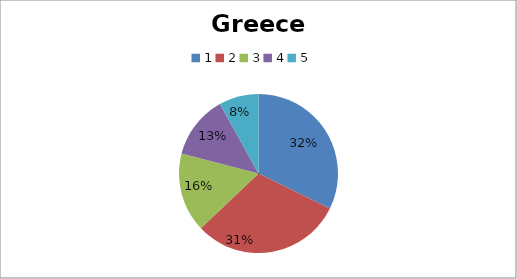
| Category | Greece |
|---|---|
| 0 | 20 |
| 1 | 19 |
| 2 | 10 |
| 3 | 8 |
| 4 | 5 |